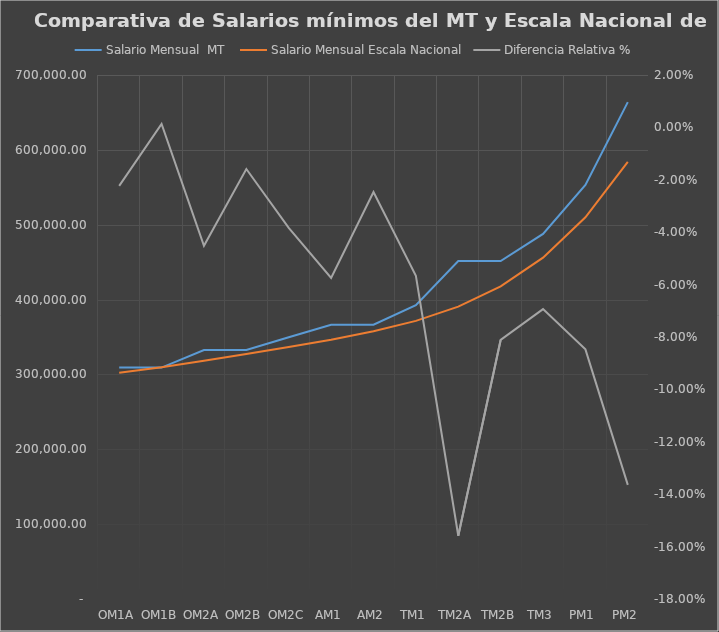
| Category | Salario Mensual  MT  | Salario Mensual Escala Nacional |
|---|---|---|
| OM1A | 309143.36 | 302392 |
| OM1B | 309143.36 | 309543 |
| OM2A | 332589.87 | 318209 |
| OM2B | 332589.87 | 327388 |
| OM2C | 349623.39 | 336716 |
| AM1 | 366380.4 | 346471 |
| AM2 | 366380.4 | 357567 |
| TM1 | 392623.14 | 371563 |
| TM2A | 451523.54 | 390642 |
| TM2B | 451523.54 | 417643 |
| TM3 | 487662.29 | 456036 |
| PM1 | 553124.45 | 509930 |
| PM2 | 663772.1 | 584072 |